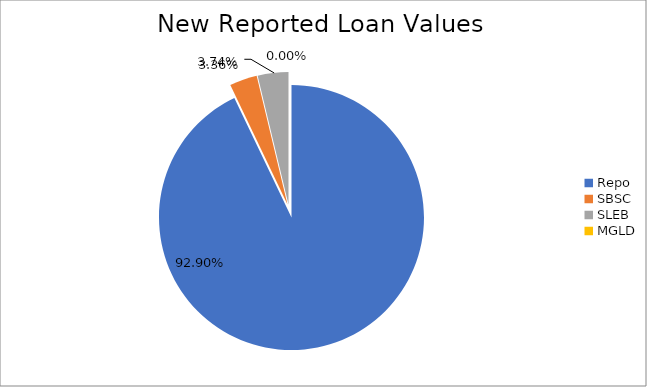
| Category | Series 0 |
|---|---|
| Repo | 7721491.506 |
| SBSC | 279173.83 |
| SLEB | 310903.466 |
| MGLD | 33.68 |